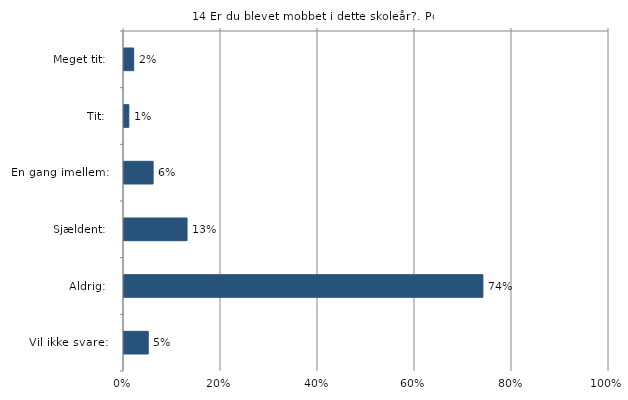
| Category | Er du blevet mobbet i dette skoleår? |
|---|---|
| Meget tit:   | 0.02 |
| Tit:   | 0.01 |
| En gang imellem:   | 0.06 |
| Sjældent:   | 0.13 |
| Aldrig:   | 0.74 |
| Vil ikke svare:   | 0.05 |